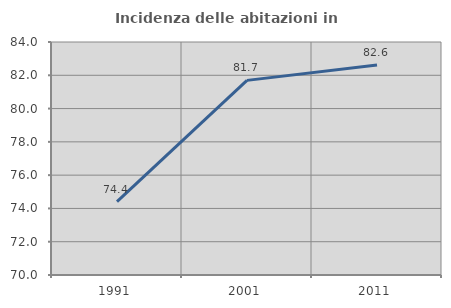
| Category | Incidenza delle abitazioni in proprietà  |
|---|---|
| 1991.0 | 74.41 |
| 2001.0 | 81.694 |
| 2011.0 | 82.615 |